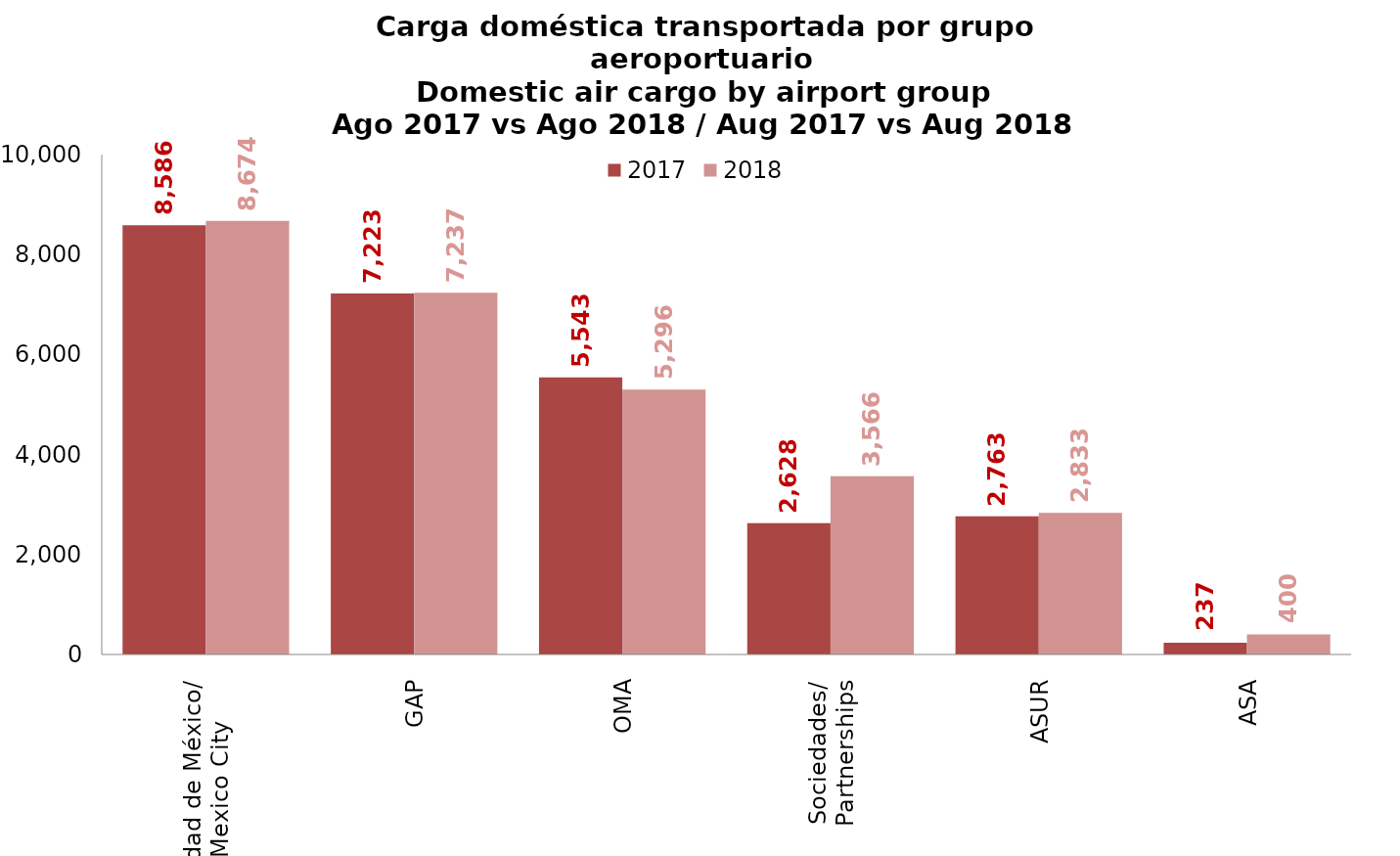
| Category | 2017 | 2018 |
|---|---|---|
| Ciudad de México/
Mexico City | 8585.53 | 8673.96 |
| GAP | 7222.846 | 7237.412 |
| OMA | 5543.492 | 5296.067 |
| Sociedades/
Partnerships | 2628.14 | 3566.24 |
| ASUR | 2763.311 | 2833.171 |
| ASA | 237.186 | 400.315 |